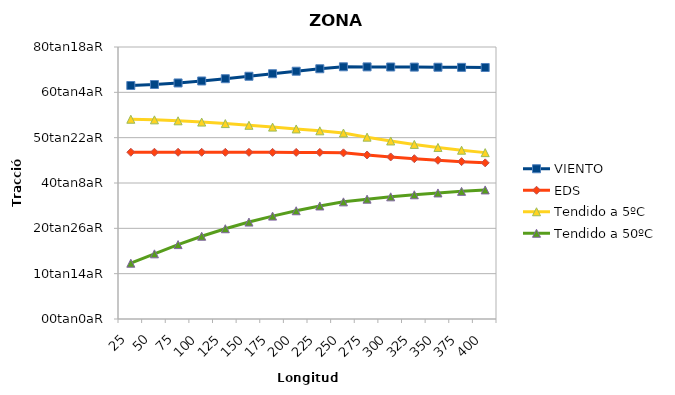
| Category | VIENTO | EDS | Tendido a 5ºC | Tendido a 50ºC |
|---|---|---|---|---|
| 25 | 2575.298 | 1839.175 | 2203.134 | 615.272 |
| 50 | 2586.241 | 1839.099 | 2196.57 | 718.775 |
| 75 | 2603.336 | 1838.973 | 2186.014 | 820.555 |
| 100 | 2625.183 | 1838.797 | 2172.008 | 912.866 |
| 125 | 2650.3 | 1838.57 | 2155.236 | 995.41 |
| 150 | 2677.326 | 1838.293 | 2136.464 | 1069.092 |
| 175 | 2705.141 | 1837.965 | 2116.466 | 1134.934 |
| 200 | 2732.887 | 1837.587 | 2095.965 | 1193.866 |
| 225 | 2759.944 | 1837.158 | 2075.578 | 1246.7 |
| 250 | 2781.695 | 1832.749 | 2051.29 | 1291.981 |
| 275 | 2780.649 | 1808.876 | 2005.52 | 1321.482 |
| 300 | 2779.502 | 1787.327 | 1963.54 | 1347.406 |
| 325 | 2778.254 | 1768.045 | 1925.617 | 1370.206 |
| 350 | 2776.906 | 1750.871 | 1891.719 | 1390.278 |
| 375 | 2775.456 | 1735.605 | 1861.618 | 1407.964 |
| 400 | 2773.904 | 1722.027 | 1834.98 | 1423.562 |